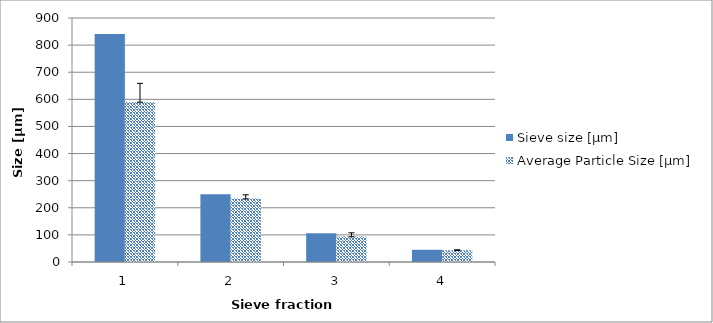
| Category | Sieve size [µm]  | Average Particle Size [µm]  |
|---|---|---|
| 0 | 841 | 590.586 |
| 1 | 250 | 233.789 |
| 2 | 106 | 94.156 |
| 3 | 45 | 43.148 |